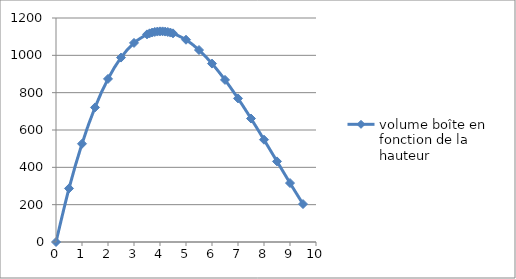
| Category | volume boîte en fonction de la hauteur |
|---|---|
| 0.0 | 0 |
| 0.5 | 287 |
| 1.0 | 526.3 |
| 1.5 | 720.9 |
| 2.0 | 873.8 |
| 2.5 | 988 |
| 3.0 | 1066.5 |
| 3.5 | 1112.3 |
| 3.6 | 1117.8 |
| 3.7 | 1122.136 |
| 3.8 | 1125.332 |
| 3.9 | 1127.412 |
| 4.0 | 1128.4 |
| 4.1 | 1128.32 |
| 4.2 | 1127.196 |
| 4.3 | 1125.052 |
| 4.4 | 1121.912 |
| 4.5 | 1117.8 |
| 5.0 | 1083.5 |
| 5.5 | 1028.5 |
| 6.0 | 955.8 |
| 6.5 | 868.4 |
| 7.0 | 769.3 |
| 7.5 | 661.5 |
| 8.0 | 548 |
| 8.5 | 431.8 |
| 9.0 | 315.9 |
| 9.5 | 203.3 |